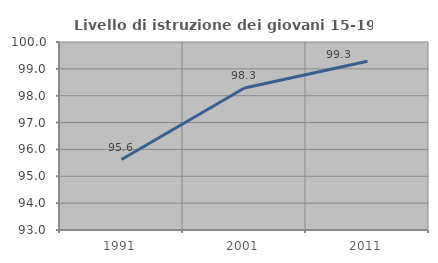
| Category | Livello di istruzione dei giovani 15-19 anni |
|---|---|
| 1991.0 | 95.623 |
| 2001.0 | 98.288 |
| 2011.0 | 99.285 |